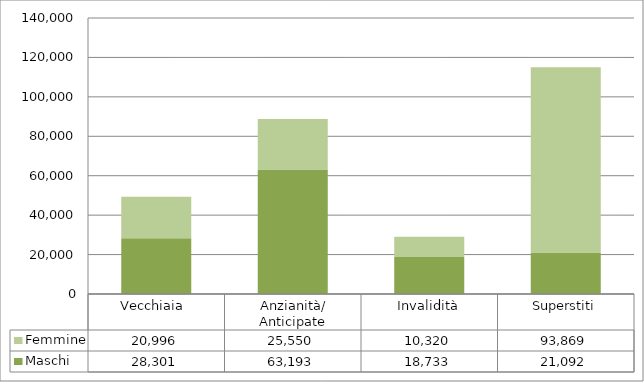
| Category | Maschi | Femmine |
|---|---|---|
| Vecchiaia  | 28301 | 20996 |
| Anzianità/ Anticipate | 63193 | 25550 |
| Invalidità | 18733 | 10320 |
| Superstiti | 21092 | 93869 |